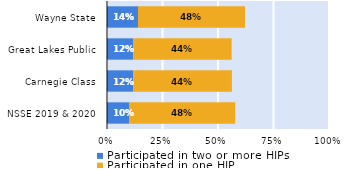
| Category | Participated in two or more HIPs | Participated in one HIP |
|---|---|---|
| NSSE 2019 & 2020 | 0.1 | 0.478 |
| Carnegie Class | 0.119 | 0.444 |
| Great Lakes Public | 0.118 | 0.443 |
| Wayne State | 0.14 | 0.482 |